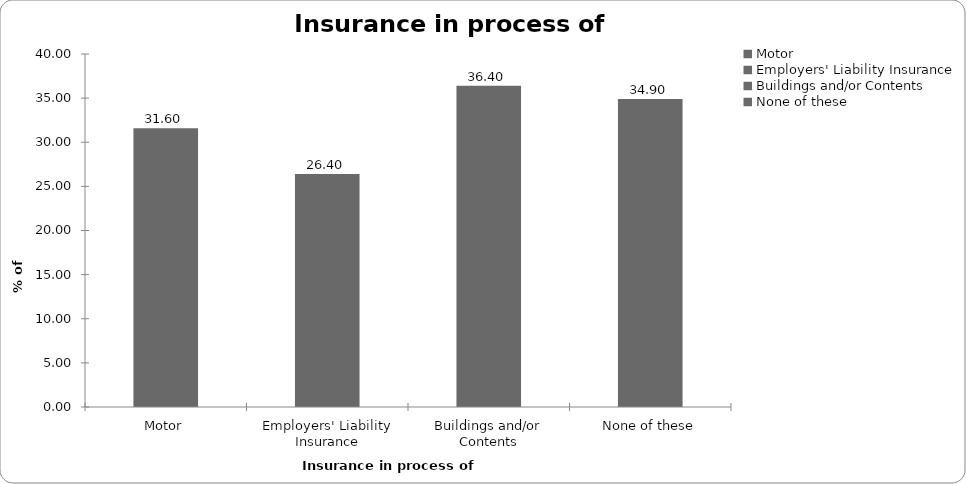
| Category | Insurance in process of buying |
|---|---|
| Motor | 31.6 |
| Employers' Liability Insurance | 26.4 |
| Buildings and/or Contents | 36.4 |
| None of these | 34.9 |